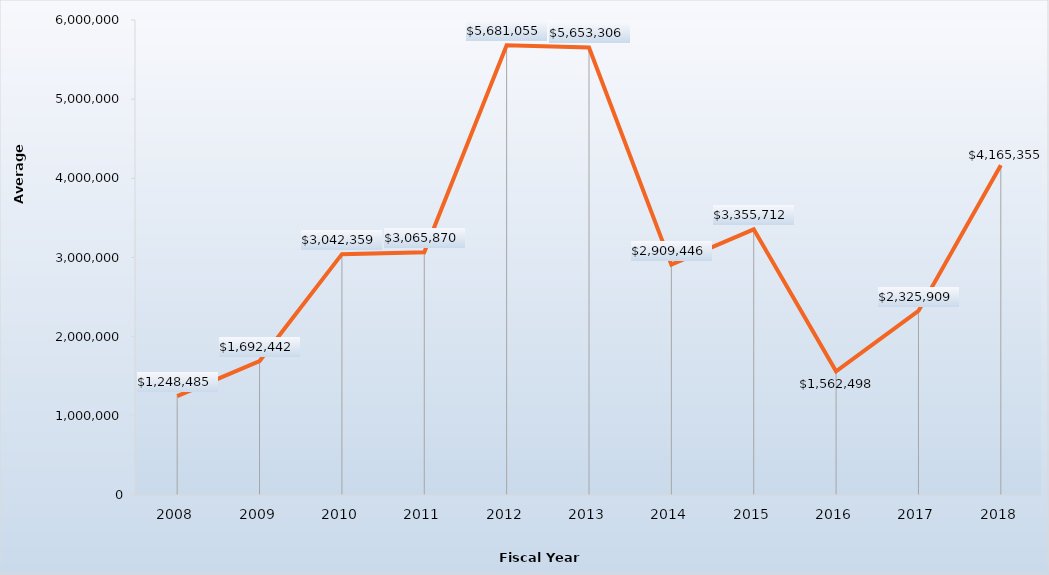
| Category | Mean |
|---|---|
| 2008.0 | 1248485 |
| 2009.0 | 1692442 |
| 2010.0 | 3042359 |
| 2011.0 | 3065870 |
| 2012.0 | 5681055 |
| 2013.0 | 5653306 |
| 2014.0 | 2909446 |
| 2015.0 | 3355712 |
| 2016.0 | 1562498 |
| 2017.0 | 2325909 |
| 2018.0 | 4165355 |